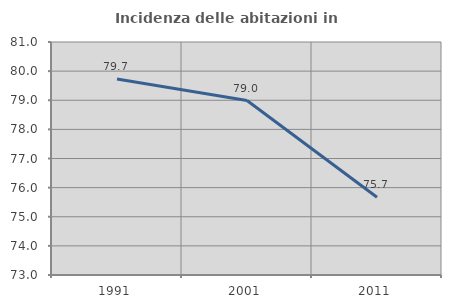
| Category | Incidenza delle abitazioni in proprietà  |
|---|---|
| 1991.0 | 79.729 |
| 2001.0 | 78.99 |
| 2011.0 | 75.67 |